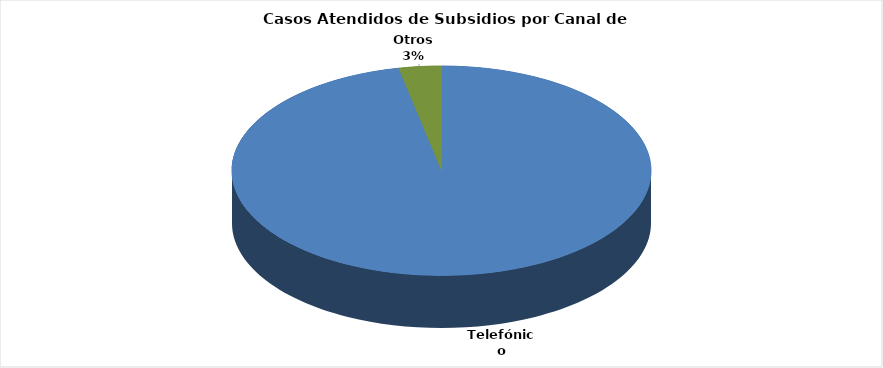
| Category | Total |
|---|---|
| Telefónico | 132253 |
| Otros | 4502 |